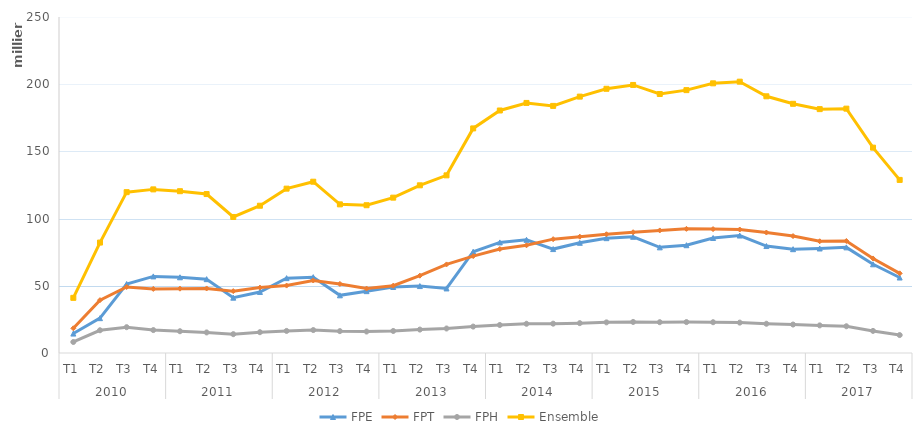
| Category | FPE | FPT | FPH | Ensemble |
|---|---|---|---|---|
| 0 | 14461 | 18375 | 8194 | 41030 |
| 1 | 25920 | 39331 | 16913 | 82164 |
| 2 | 51330 | 49127 | 19215 | 119672 |
| 3 | 56997 | 47685 | 17058 | 121740 |
| 4 | 56333 | 47855 | 16199 | 120387 |
| 5 | 54941 | 48017 | 15304 | 118262 |
| 6 | 41169 | 46030 | 14012 | 101211 |
| 7 | 45419 | 48677 | 15477 | 109573 |
| 8 | 55694 | 50172 | 16422 | 122288 |
| 9 | 56439 | 53952 | 17062 | 127453 |
| 10 | 42911 | 51408 | 16274 | 110593 |
| 11 | 46016 | 47957 | 15977 | 109950 |
| 12 | 49098 | 50100 | 16390 | 115588 |
| 13 | 49798 | 57543 | 17423 | 124764 |
| 14 | 48046 | 65901 | 18228 | 132175 |
| 15 | 75352 | 72092 | 19655 | 167099 |
| 16 | 82269 | 77335 | 20830 | 180434 |
| 17 | 84197 | 80120 | 21744 | 186061 |
| 18 | 77322 | 84712 | 21821 | 183855 |
| 19 | 81992 | 86552 | 22218 | 190762 |
| 20 | 85438 | 88354 | 22793 | 196585 |
| 21 | 86468 | 89868 | 23104 | 199440 |
| 22 | 78611 | 91183 | 22915 | 192709 |
| 23 | 80203 | 92369 | 23008 | 195580 |
| 24 | 85564 | 92183 | 22899 | 200646 |
| 25 | 87386 | 91885 | 22610 | 201881 |
| 26 | 79587 | 89645 | 21763 | 190995 |
| 27 | 77240 | 86998 | 21175 | 185413 |
| 28 | 77764 | 83129 | 20553 | 181446 |
| 29 | 78598 | 83323 | 19893 | 181814 |
| 30 | 65993 | 70352 | 16445 | 152790 |
| 31 | 56157 | 59278 | 13353 | 128788 |